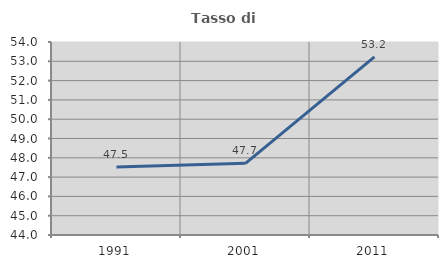
| Category | Tasso di occupazione   |
|---|---|
| 1991.0 | 47.521 |
| 2001.0 | 47.714 |
| 2011.0 | 53.234 |